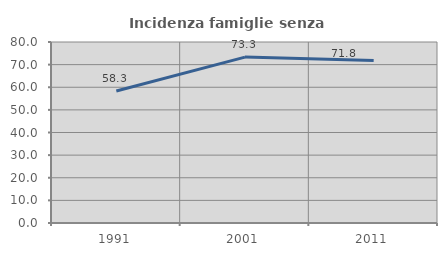
| Category | Incidenza famiglie senza nuclei |
|---|---|
| 1991.0 | 58.333 |
| 2001.0 | 73.333 |
| 2011.0 | 71.795 |